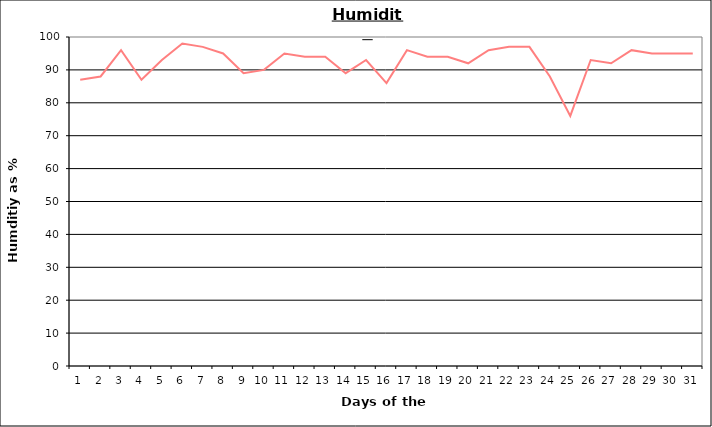
| Category | Series 0 |
|---|---|
| 0 | 87 |
| 1 | 88 |
| 2 | 96 |
| 3 | 87 |
| 4 | 93 |
| 5 | 98 |
| 6 | 97 |
| 7 | 95 |
| 8 | 89 |
| 9 | 90 |
| 10 | 95 |
| 11 | 94 |
| 12 | 94 |
| 13 | 89 |
| 14 | 93 |
| 15 | 86 |
| 16 | 96 |
| 17 | 94 |
| 18 | 94 |
| 19 | 92 |
| 20 | 96 |
| 21 | 97 |
| 22 | 97 |
| 23 | 88 |
| 24 | 76 |
| 25 | 93 |
| 26 | 92 |
| 27 | 96 |
| 28 | 95 |
| 29 | 95 |
| 30 | 95 |